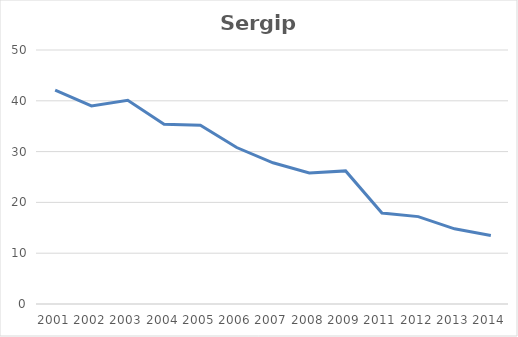
| Category | Total |
|---|---|
| 2001.0 | 42.1 |
| 2002.0 | 39 |
| 2003.0 | 40.1 |
| 2004.0 | 35.4 |
| 2005.0 | 35.2 |
| 2006.0 | 30.8 |
| 2007.0 | 27.8 |
| 2008.0 | 25.8 |
| 2009.0 | 26.2 |
| 2011.0 | 17.9 |
| 2012.0 | 17.2 |
| 2013.0 | 14.8 |
| 2014.0 | 13.5 |